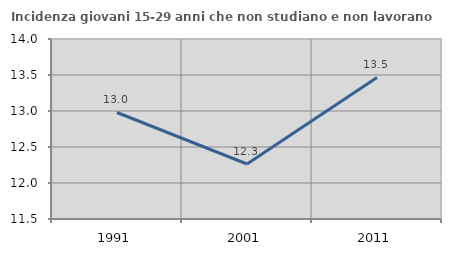
| Category | Incidenza giovani 15-29 anni che non studiano e non lavorano  |
|---|---|
| 1991.0 | 12.979 |
| 2001.0 | 12.264 |
| 2011.0 | 13.466 |